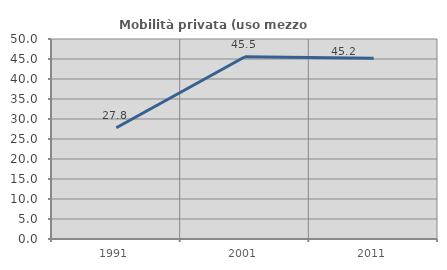
| Category | Mobilità privata (uso mezzo privato) |
|---|---|
| 1991.0 | 27.812 |
| 2001.0 | 45.549 |
| 2011.0 | 45.176 |